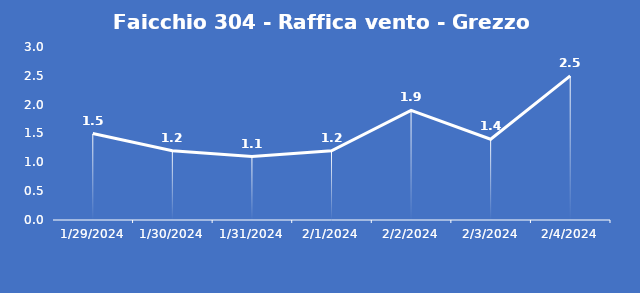
| Category | Faicchio 304 - Raffica vento - Grezzo (m/s) |
|---|---|
| 1/29/24 | 1.5 |
| 1/30/24 | 1.2 |
| 1/31/24 | 1.1 |
| 2/1/24 | 1.2 |
| 2/2/24 | 1.9 |
| 2/3/24 | 1.4 |
| 2/4/24 | 2.5 |